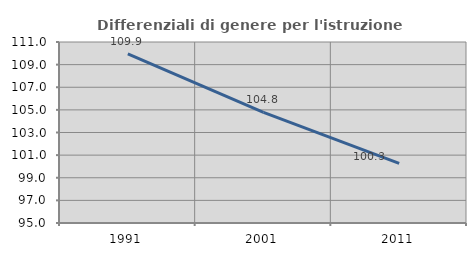
| Category | Differenziali di genere per l'istruzione superiore |
|---|---|
| 1991.0 | 109.947 |
| 2001.0 | 104.779 |
| 2011.0 | 100.27 |